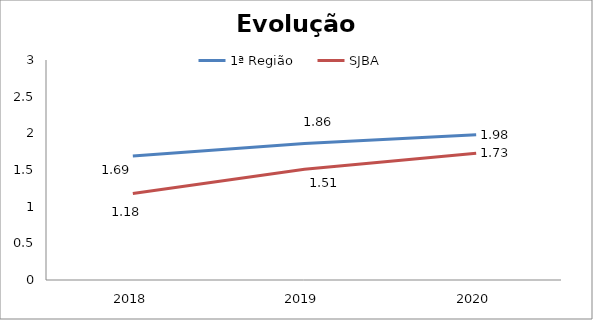
| Category | 1ª Região | SJBA |
|---|---|---|
| 0 | 1.69 | 1.18 |
| 1 | 1.86 | 1.51 |
| 2 | 1.98 | 1.73 |